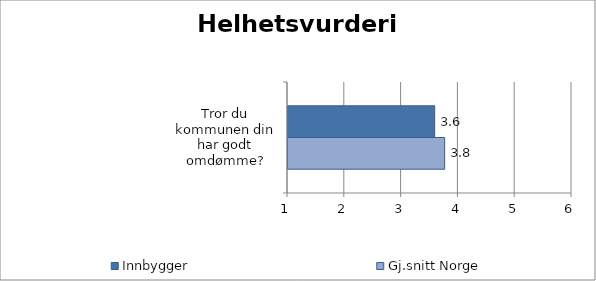
| Category | Innbygger | Gj.snitt Norge |
|---|---|---|
| Tror du kommunen din har godt omdømme? | 3.583 | 3.758 |